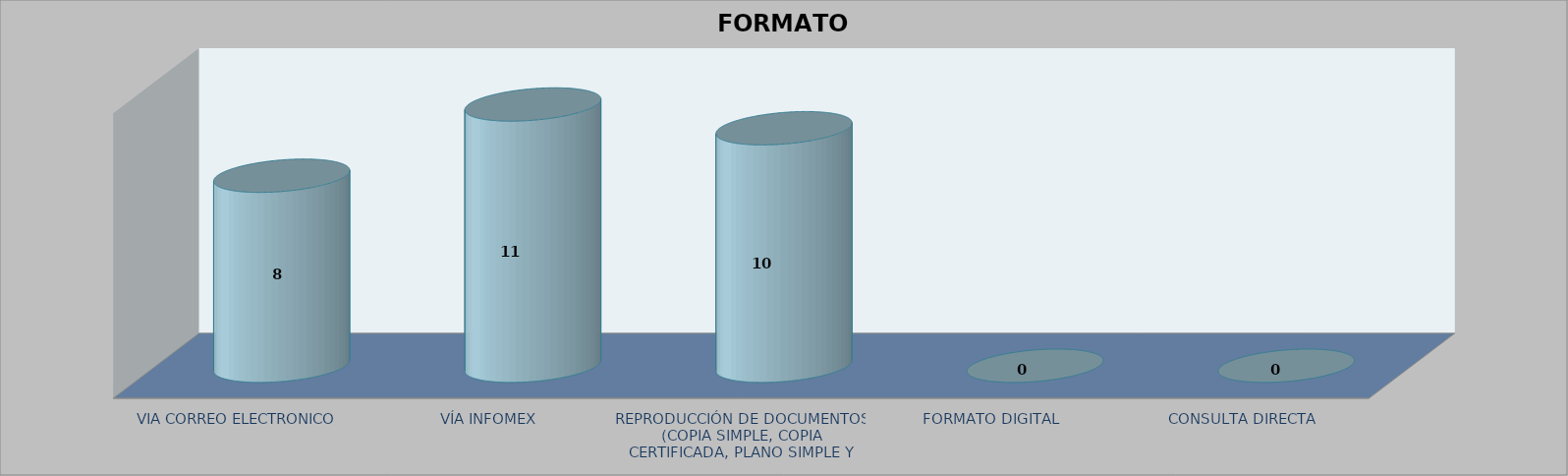
| Category |        FORMATO SOLICITADO | Series 1 | Series 2 |
|---|---|---|---|
| VIA CORREO ELECTRONICO |  |  | 8 |
| VÍA INFOMEX |  |  | 11 |
| REPRODUCCIÓN DE DOCUMENTOS (COPIA SIMPLE, COPIA CERTIFICADA, PLANO SIMPLE Y PLANO CERTIFICADO) |  |  | 10 |
| FORMATO DIGITAL |  |  | 0 |
| CONSULTA DIRECTA |  |  | 0 |